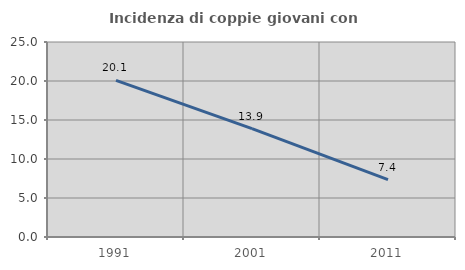
| Category | Incidenza di coppie giovani con figli |
|---|---|
| 1991.0 | 20.077 |
| 2001.0 | 13.889 |
| 2011.0 | 7.357 |